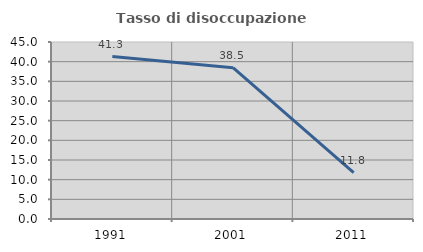
| Category | Tasso di disoccupazione giovanile  |
|---|---|
| 1991.0 | 41.304 |
| 2001.0 | 38.462 |
| 2011.0 | 11.765 |